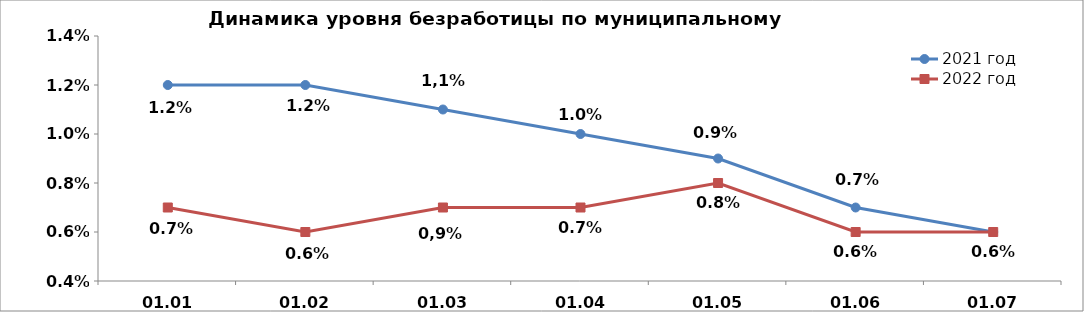
| Category | 2021 год | 2022 год |
|---|---|---|
| 01.01 | 0.012 | 0.007 |
| 01.02 | 0.012 | 0.006 |
| 01.03 | 0.011 | 0.007 |
| 01.04 | 0.01 | 0.007 |
| 01.05 | 0.009 | 0.008 |
| 01.06 | 0.007 | 0.006 |
| 01.07 | 0.006 | 0.006 |